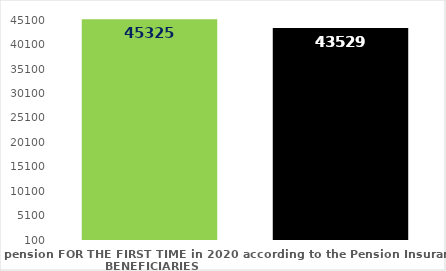
| Category | broj korisnika |
|---|---|
| Pension beneficiaries entitled to pension FOR THE FIRST TIME in 2020 according to the Pension Insurance Act  - NEW BENEFICIARIES | 45325 |
| Pension beneficiaries whose pension entitlement ceased in 2020  -  death caused,   
and who were retired according to the Pension Insurance Act   | 43529 |